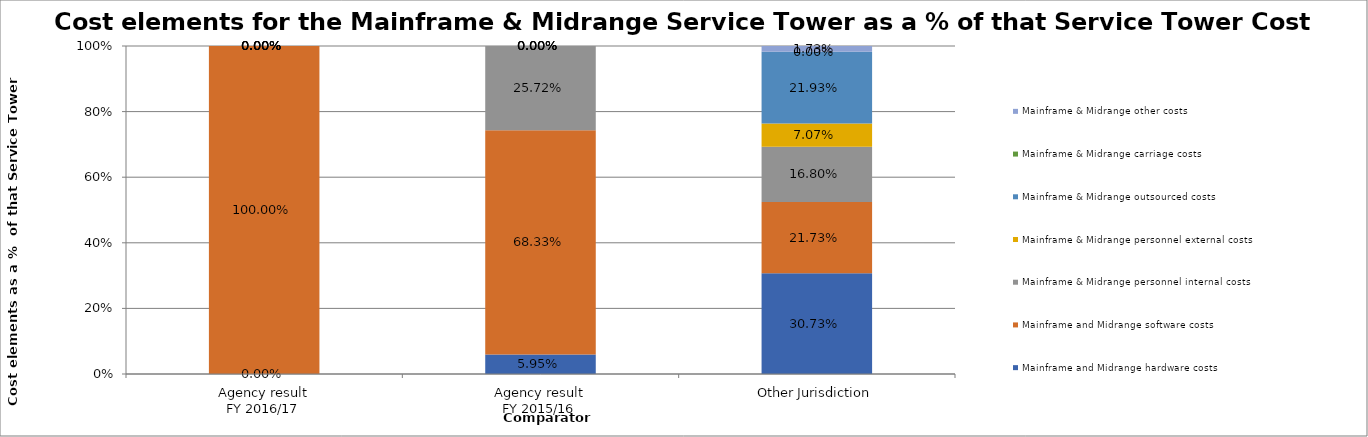
| Category | Mainframe and Midrange hardware costs | Mainframe and Midrange software costs | Mainframe & Midrange personnel internal costs | Mainframe & Midrange personnel external costs | Mainframe & Midrange outsourced costs | Mainframe & Midrange carriage costs | Mainframe & Midrange other costs |
|---|---|---|---|---|---|---|---|
| Agency result
FY 2016/17 | 0 | 1 | 0 | 0 | 0 | 0 | 0 |
| Agency result
FY 2015/16 | 0.06 | 0.683 | 0.257 | 0 | 0 | 0 | 0 |
| Other Jurisdiction | 0.307 | 0.217 | 0.168 | 0.071 | 0.219 | 0 | 0.017 |